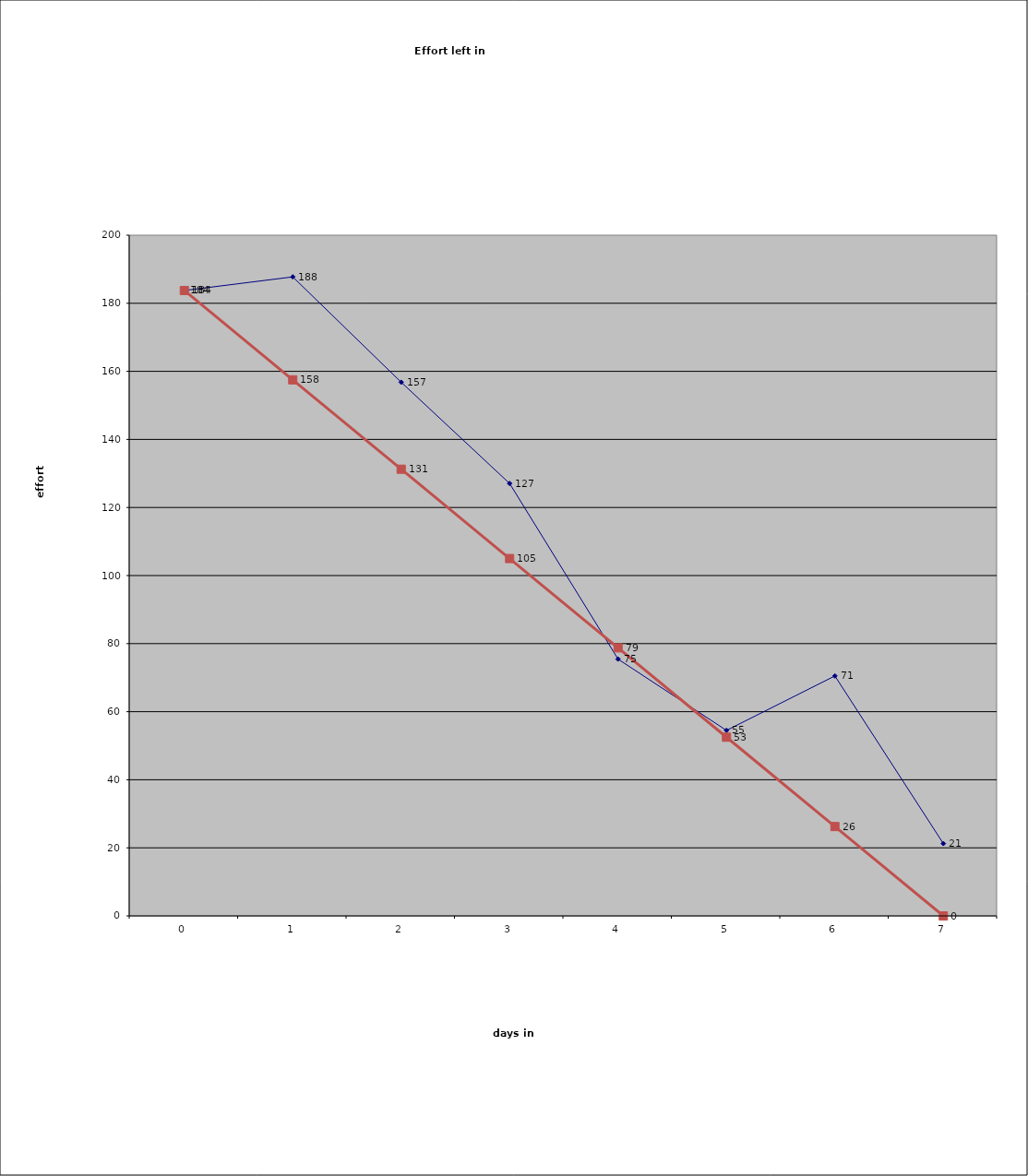
| Category | Effort left, ideal hours | Ideal Velocity |
|---|---|---|
| 0.0 | 183.75 | 183.75 |
| 1.0 | 187.75 | 157.5 |
| 2.0 | 156.8 | 131.25 |
| 3.0 | 127.05 | 105 |
| 4.0 | 75.45 | 78.75 |
| 5.0 | 54.5 | 52.5 |
| 6.0 | 70.5 | 26.25 |
| 7.0 | 21.25 | 0 |